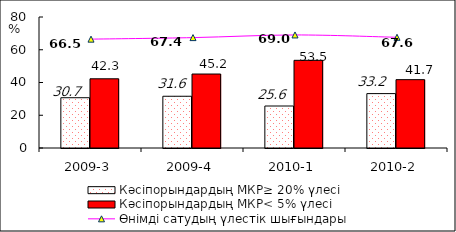
| Category | Кәсіпорындардың МКР≥ 20% үлесі | Кәсіпорындардың МКР< 5% үлесі |
|---|---|---|
| 2009-3 | 30.697 | 42.269 |
| 2009-4 | 31.598 | 45.172 |
| 2010-1 | 25.646 | 53.542 |
| 2010-2 | 33.222 | 41.738 |